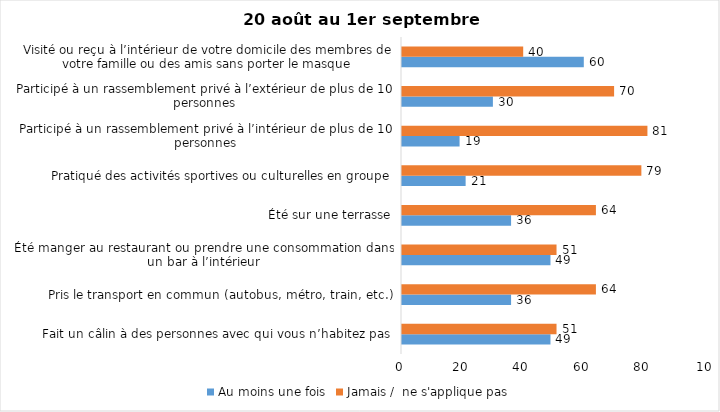
| Category | Au moins une fois | Jamais /  ne s'applique pas |
|---|---|---|
| Fait un câlin à des personnes avec qui vous n’habitez pas | 49 | 51 |
| Pris le transport en commun (autobus, métro, train, etc.) | 36 | 64 |
| Été manger au restaurant ou prendre une consommation dans un bar à l’intérieur | 49 | 51 |
| Été sur une terrasse | 36 | 64 |
| Pratiqué des activités sportives ou culturelles en groupe | 21 | 79 |
| Participé à un rassemblement privé à l’intérieur de plus de 10 personnes | 19 | 81 |
| Participé à un rassemblement privé à l’extérieur de plus de 10 personnes | 30 | 70 |
| Visité ou reçu à l’intérieur de votre domicile des membres de votre famille ou des amis sans porter le masque | 60 | 40 |